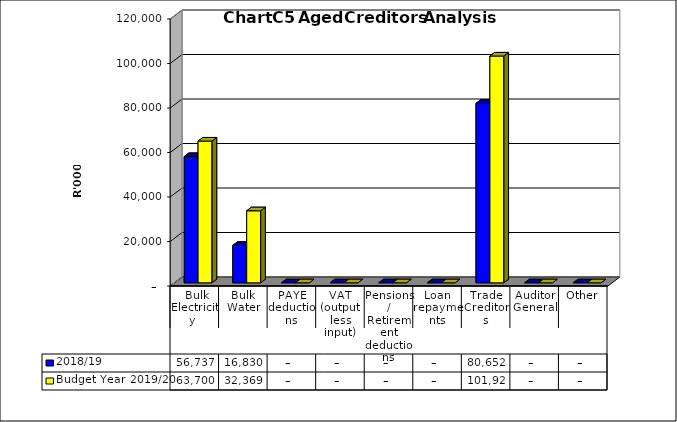
| Category | 2018/19 | Budget Year 2019/20 |
|---|---|---|
|  Bulk Electricity  | 56736770.29 | 63699731.79 |
| Bulk Water | 16830241.24 | 32368717.61 |
| PAYE deductions | 0 | 0 |
| VAT (output less input) | 0 | 0 |
| Pensions / Retirement deductions | 0 | 0 |
| Loan repayments | 0 | 0 |
| Trade Creditors | 80651537.55 | 101926763.87 |
| Auditor General | 0 | 0 |
| Other | 0 | 0 |